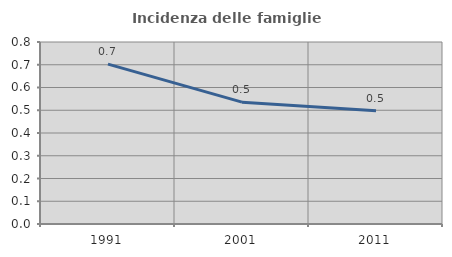
| Category | Incidenza delle famiglie numerose |
|---|---|
| 1991.0 | 0.703 |
| 2001.0 | 0.536 |
| 2011.0 | 0.498 |